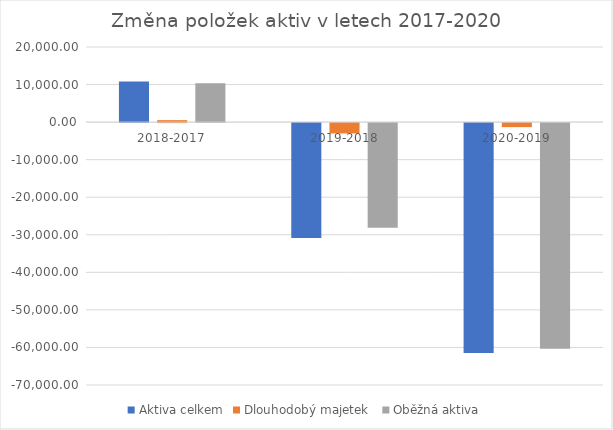
| Category | Aktiva celkem | Dlouhodobý majetek  | Oběžná aktiva |
|---|---|---|---|
| 2018-2017 | 10841 | 521 | 10320 |
| 2019-2018 | -30603 | -2754 | -27849 |
| 2020-2019 | -61180 | -1067 | -60113 |